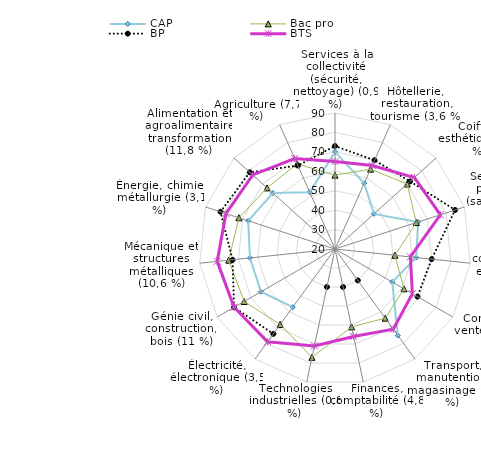
| Category | CAP | Bac pro | BP | BTS |
|---|---|---|---|---|
| Services à la collectivité (sécurité, nettoyage) (0,9 %) | 70 | 58 | 73 | 65 |
| Hôtellerie, restauration, tourisme (3,6 %) | 57 | 65 | 70 | 67 |
| Coiffure esthétique (3,7 %) | 47 | 70 | 72 | 75 |
| Services aux personnes (santé, social) (13,5 %) | 65 | 64 | 85 | 77 |
| Secrétariat, communication et information (4,1 %) | 62 | 51 | 70 | 59 |
| Commerce, vente (17,6 %) | 54 | 61 | 69 | 66 |
| Transport, manutention, magasinage (2,7 %) | 75 | 64 | 0 | 71 |
| Finances, comptabilité (4,8 %) | 0 | 61 | 0 | 66 |
| Technologies industrielles (0,8 %) | 0 | 77 | 0 | 71 |
| Électricité, électronique (3,5 %) | 57 | 68 | 74 | 79 |
| Génie civil, construction, bois (11 %) | 64 | 74 | 80 | 80 |
| Mécanique et structures métalliques (10,6 %) | 64 | 75 | 73 | 81 |
| Énergie, chimie, métallurgie (3,1 %) | 67 | 72 | 82 | 79 |
| Alimentation et agroalimentaire transformation (11,8 %) | 63 | 67 | 79 | 77 |
| Agriculture (7,7 %) | 52 | 68 | 67 | 71 |